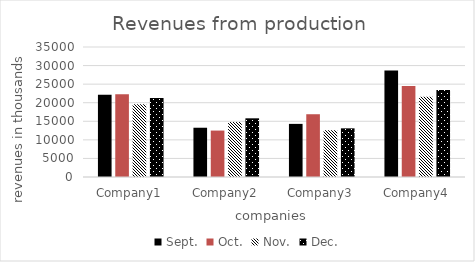
| Category | Sept. | Oct. | Nov. | Dec. |
|---|---|---|---|---|
| Company1 | 22160 | 22300 | 19600 | 21300 |
| Company2 | 13262 | 12500 | 14800 | 15800 |
| Company3 | 14300 | 16900 | 12600 | 13100 |
| Company4 | 28700 | 24500 | 21600 | 23400 |